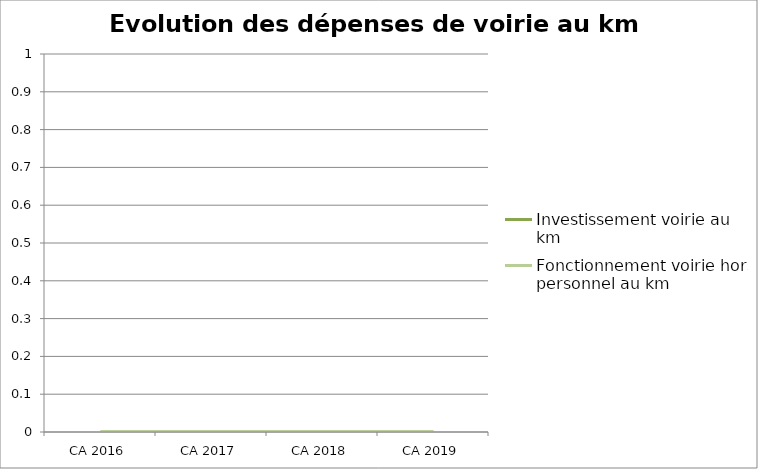
| Category | Investissement voirie au km | Fonctionnement voirie hors personnel au km |
|---|---|---|
| CA 2016 | 0 | 0 |
| CA 2017 | 0 | 0 |
| CA 2018 | 0 | 0 |
| CA 2019 | 0 | 0 |